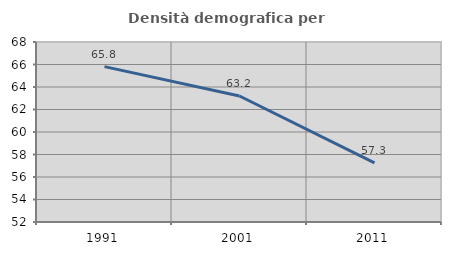
| Category | Densità demografica |
|---|---|
| 1991.0 | 65.81 |
| 2001.0 | 63.202 |
| 2011.0 | 57.262 |